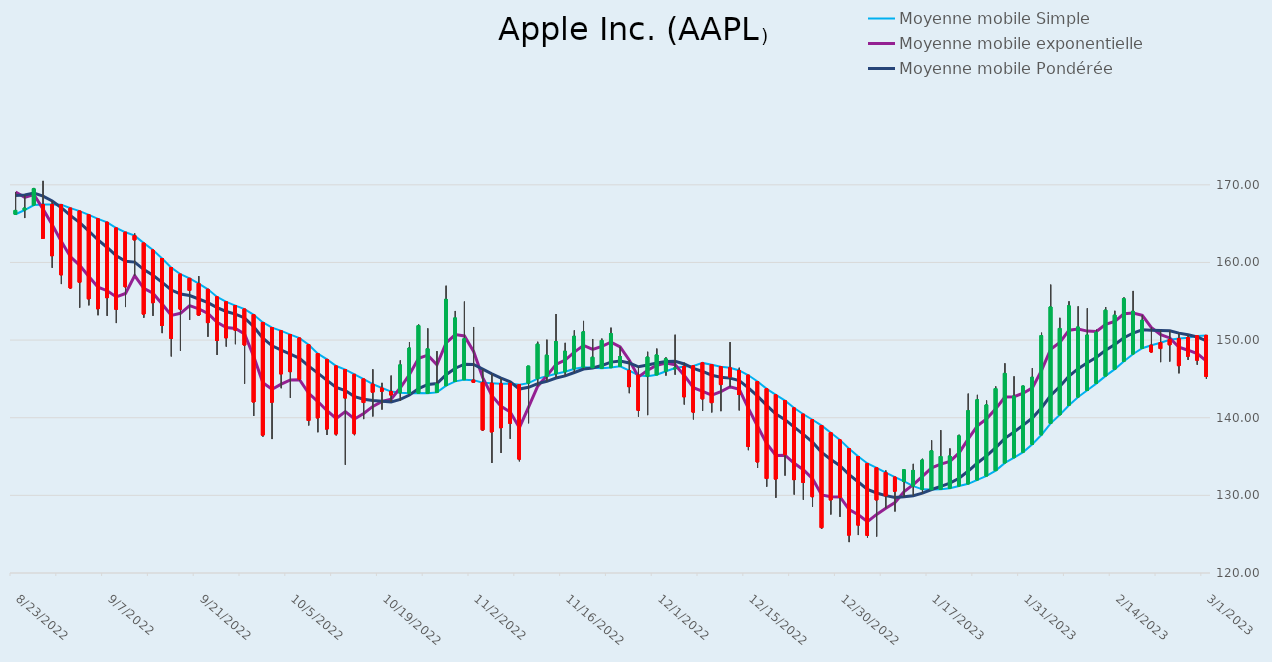
| Category | Moyenne mobile Simple | Moyenne mobile exponentielle | Moyenne mobile Pondérée |
|---|---|---|---|
| 8/23/22 | 166.208 | 169.075 | 168.615 |
| 8/24/22 | 166.754 | 168.382 | 168.691 |
| 8/25/22 | 167.397 | 168.752 | 168.951 |
| 8/26/22 | 167.463 | 166.868 | 168.542 |
| 8/29/22 | 167.468 | 164.867 | 167.914 |
| 8/30/22 | 167.424 | 162.713 | 167.051 |
| 8/31/22 | 166.992 | 160.716 | 166.031 |
| 9/1/22 | 166.612 | 159.63 | 165.123 |
| 9/2/22 | 166.136 | 158.191 | 164.047 |
| 9/6/22 | 165.621 | 156.807 | 162.895 |
| 9/7/22 | 165.174 | 156.36 | 161.928 |
| 9/8/22 | 164.438 | 155.563 | 160.861 |
| 9/9/22 | 163.884 | 155.998 | 160.14 |
| 9/12/22 | 163.451 | 158.303 | 160.047 |
| 9/13/22 | 162.487 | 156.652 | 159.085 |
| 9/14/22 | 161.604 | 156.04 | 158.355 |
| 9/15/22 | 160.498 | 154.655 | 157.429 |
| 9/16/22 | 159.33 | 153.177 | 156.451 |
| 9/19/22 | 158.48 | 153.448 | 155.942 |
| 9/20/22 | 157.948 | 154.432 | 155.744 |
| 9/21/22 | 157.275 | 154.032 | 155.295 |
| 9/22/22 | 156.538 | 153.44 | 154.817 |
| 9/23/22 | 155.561 | 152.277 | 154.189 |
| 9/26/22 | 154.921 | 151.615 | 153.687 |
| 9/27/22 | 154.441 | 151.503 | 153.34 |
| 9/28/22 | 153.989 | 150.79 | 152.857 |
| 9/29/22 | 153.254 | 147.869 | 151.718 |
| 9/30/22 | 152.27 | 144.499 | 150.242 |
| 10/3/22 | 151.604 | 143.665 | 149.264 |
| 10/4/22 | 151.183 | 144.322 | 148.695 |
| 10/5/22 | 150.707 | 144.86 | 148.196 |
| 10/6/22 | 150.257 | 144.896 | 147.649 |
| 10/7/22 | 149.396 | 143.145 | 146.638 |
| 10/10/22 | 148.249 | 142.088 | 145.741 |
| 10/11/22 | 147.508 | 140.905 | 144.816 |
| 10/12/22 | 146.662 | 139.903 | 143.901 |
| 10/13/22 | 146.195 | 140.781 | 143.508 |
| 10/14/22 | 145.581 | 139.834 | 142.722 |
| 10/17/22 | 144.979 | 140.542 | 142.377 |
| 10/18/22 | 144.324 | 141.459 | 142.216 |
| 10/19/22 | 143.832 | 142.107 | 142.129 |
| 10/20/22 | 143.366 | 142.383 | 142.043 |
| 10/21/22 | 143.209 | 143.856 | 142.37 |
| 10/24/22 | 143.143 | 145.562 | 142.919 |
| 10/25/22 | 143.172 | 147.66 | 143.749 |
| 10/26/22 | 143.148 | 148.065 | 144.292 |
| 10/27/22 | 143.263 | 146.823 | 144.406 |
| 10/28/22 | 144.137 | 149.631 | 145.547 |
| 10/31/22 | 144.68 | 150.705 | 146.377 |
| 11/1/22 | 144.907 | 150.527 | 146.9 |
| 11/2/22 | 144.839 | 148.541 | 146.868 |
| 11/3/22 | 144.512 | 145.173 | 146.258 |
| 11/4/22 | 144.438 | 142.839 | 145.654 |
| 11/7/22 | 144.375 | 141.462 | 145.108 |
| 11/8/22 | 144.413 | 140.737 | 144.624 |
| 11/9/22 | 144.251 | 138.713 | 143.695 |
| 11/10/22 | 144.456 | 141.357 | 143.924 |
| 11/11/22 | 145.033 | 144.062 | 144.401 |
| 11/14/22 | 145.338 | 145.393 | 144.689 |
| 11/15/22 | 145.664 | 146.866 | 145.115 |
| 11/16/22 | 145.922 | 147.431 | 145.391 |
| 11/17/22 | 146.3 | 148.451 | 145.826 |
| 11/18/22 | 146.512 | 149.32 | 146.279 |
| 11/21/22 | 146.453 | 148.808 | 146.401 |
| 11/22/22 | 146.358 | 149.189 | 146.734 |
| 11/23/22 | 146.456 | 149.739 | 147.161 |
| 11/25/22 | 146.633 | 149.121 | 147.297 |
| 11/28/22 | 146.071 | 147.414 | 147.046 |
| 11/29/22 | 145.476 | 145.261 | 146.559 |
| 11/30/22 | 145.358 | 146.109 | 146.78 |
| 12/1/22 | 145.533 | 146.767 | 147.04 |
| 12/2/22 | 145.991 | 147.04 | 147.235 |
| 12/5/22 | 146.402 | 146.829 | 147.275 |
| 12/6/22 | 146.602 | 145.45 | 146.922 |
| 12/7/22 | 146.674 | 143.875 | 146.362 |
| 12/8/22 | 147.062 | 143.394 | 145.958 |
| 12/9/22 | 146.827 | 142.91 | 145.471 |
| 12/12/22 | 146.567 | 143.364 | 145.227 |
| 12/13/22 | 146.426 | 143.992 | 145.102 |
| 12/14/22 | 146.085 | 143.658 | 144.774 |
| 12/15/22 | 145.472 | 141.203 | 143.842 |
| 12/16/22 | 144.663 | 138.904 | 142.778 |
| 12/19/22 | 143.718 | 136.658 | 141.588 |
| 12/20/22 | 142.934 | 135.138 | 140.482 |
| 12/21/22 | 142.198 | 135.173 | 139.749 |
| 12/22/22 | 141.258 | 134.125 | 138.781 |
| 12/23/22 | 140.447 | 133.303 | 137.866 |
| 12/27/22 | 139.738 | 132.146 | 136.856 |
| 12/28/22 | 138.983 | 130.047 | 135.533 |
| 12/29/22 | 138.063 | 129.835 | 134.621 |
| 12/30/22 | 137.146 | 129.801 | 133.828 |
| 1/3/23 | 136.01 | 128.16 | 132.659 |
| 1/4/23 | 134.998 | 127.496 | 131.722 |
| 1/5/23 | 134.105 | 126.607 | 130.754 |
| 1/6/23 | 133.54 | 127.546 | 130.308 |
| 1/9/23 | 132.916 | 128.348 | 129.966 |
| 1/10/23 | 132.345 | 129.075 | 129.739 |
| 1/11/23 | 131.796 | 130.479 | 129.828 |
| 1/12/23 | 131.194 | 131.388 | 129.963 |
| 1/13/23 | 130.772 | 132.444 | 130.283 |
| 1/17/23 | 130.744 | 133.54 | 130.755 |
| 1/18/23 | 130.779 | 134.028 | 131.161 |
| 1/19/23 | 130.924 | 134.373 | 131.569 |
| 1/20/23 | 131.202 | 135.469 | 132.21 |
| 1/23/23 | 131.485 | 137.277 | 133.133 |
| 1/24/23 | 131.999 | 138.956 | 134.165 |
| 1/25/23 | 132.498 | 139.852 | 135.083 |
| 1/26/23 | 133.194 | 141.148 | 136.154 |
| 1/27/23 | 134.187 | 142.668 | 137.346 |
| 1/30/23 | 134.855 | 142.706 | 138.164 |
| 1/31/23 | 135.572 | 143.161 | 139.042 |
| 2/1/23 | 136.588 | 143.843 | 139.96 |
| 2/2/23 | 137.81 | 146.092 | 141.293 |
| 2/3/23 | 139.281 | 148.816 | 142.86 |
| 2/6/23 | 140.385 | 149.71 | 144.024 |
| 2/7/23 | 141.608 | 151.278 | 145.36 |
| 2/8/23 | 142.666 | 151.415 | 146.32 |
| 2/9/23 | 143.534 | 151.157 | 147.079 |
| 2/10/23 | 144.424 | 151.108 | 147.791 |
| 2/13/23 | 145.389 | 152.022 | 148.689 |
| 2/14/23 | 146.262 | 152.415 | 149.433 |
| 2/15/23 | 147.278 | 153.386 | 150.297 |
| 2/16/23 | 148.211 | 153.494 | 150.909 |
| 2/17/23 | 148.955 | 153.18 | 151.322 |
| 2/21/23 | 149.335 | 151.613 | 151.277 |
| 2/22/23 | 149.664 | 150.712 | 151.237 |
| 2/23/23 | 150.052 | 150.275 | 151.212 |
| 2/24/23 | 150.201 | 149.086 | 150.893 |
| 2/27/23 | 150.311 | 148.698 | 150.676 |
| 2/28/23 | 150.543 | 148.268 | 150.4 |
| 3/1/23 | 150.605 | 147.282 | 149.901 |